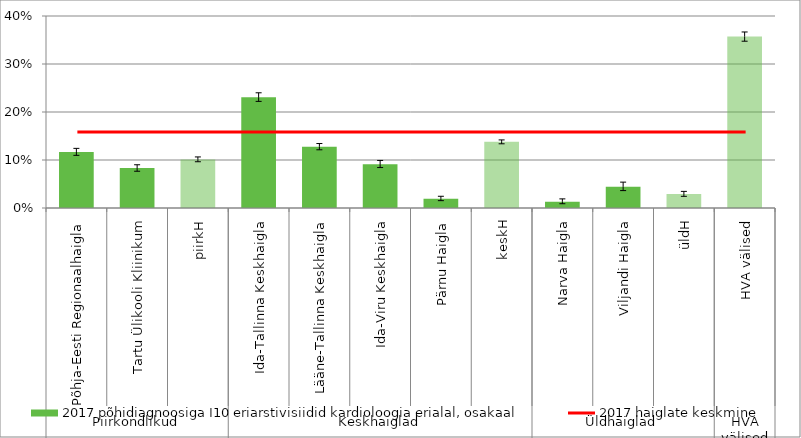
| Category | 2017 põhidiagnoosiga I10 eriarstivisiidid kardioloogia erialal, osakaal |
|---|---|
| 0 | 0.117 |
| 1 | 0.083 |
| 2 | 0.101 |
| 3 | 0.231 |
| 4 | 0.128 |
| 5 | 0.091 |
| 6 | 0.019 |
| 7 | 0.138 |
| 8 | 0.013 |
| 9 | 0.044 |
| 10 | 0.029 |
| 11 | 0.357 |